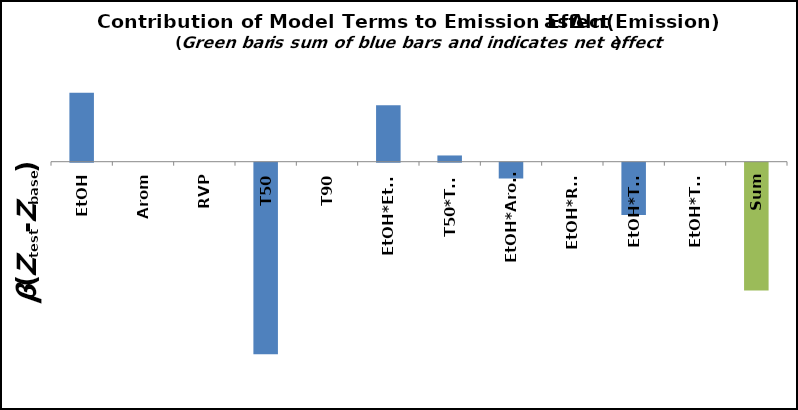
| Category | Ztest |
|---|---|
| EtOH | 0.102 |
| Arom | 0 |
| RVP | 0 |
| T50 | -0.282 |
| T90 | 0 |
| EtOH*EtOH | 0.083 |
| T50*T50 | 0.009 |
| EtOH*Arom | -0.023 |
| EtOH*RVP | 0 |
| EtOH*T50 | -0.077 |
| EtOH*T90 | 0 |
| Sum | -0.189 |